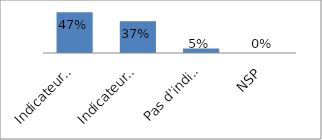
| Category | Series 0 |
|---|---|
| Indicateurs pour tous les programmes | 0.474 |
| Indicateurs pour quelques programmes | 0.368 |
| Pas d'indicateurs | 0.053 |
| NSP | 0 |